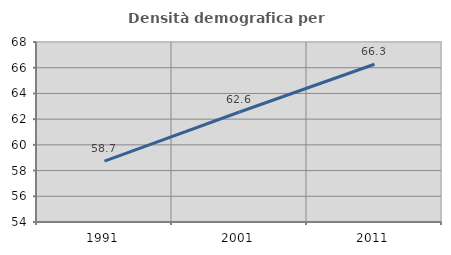
| Category | Densità demografica |
|---|---|
| 1991.0 | 58.741 |
| 2001.0 | 62.558 |
| 2011.0 | 66.267 |